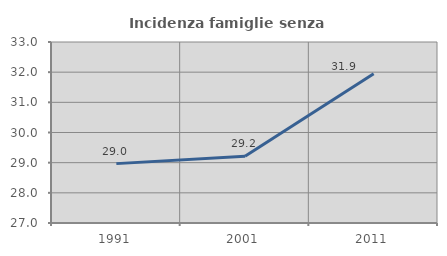
| Category | Incidenza famiglie senza nuclei |
|---|---|
| 1991.0 | 28.968 |
| 2001.0 | 29.215 |
| 2011.0 | 31.946 |